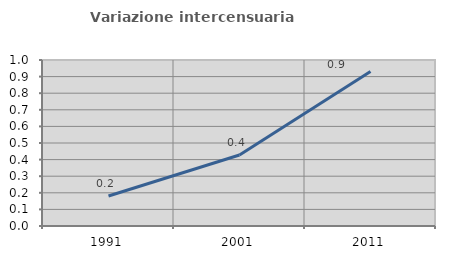
| Category | Variazione intercensuaria annua |
|---|---|
| 1991.0 | 0.18 |
| 2001.0 | 0.428 |
| 2011.0 | 0.931 |